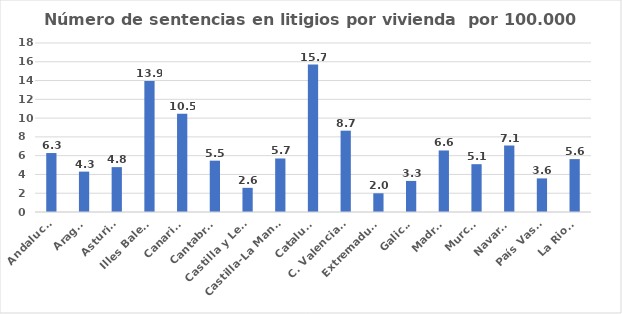
| Category | Número de sentencias en litigios por vivienda  por 100.000 habitantes |
|---|---|
| Andalucía | 6.28 |
| Aragón | 4.301 |
| Asturias | 4.779 |
| Illes Balears | 13.943 |
| Canarias | 10.476 |
| Cantabria | 5.468 |
| Castilla y León | 2.574 |
| Castilla-La Mancha | 5.701 |
| Cataluña | 15.7 |
| C. Valenciana | 8.663 |
| Extremadura | 1.992 |
| Galicia | 3.31 |
| Madrid | 6.554 |
| Murcia | 5.093 |
| Navarra | 7.082 |
| País Vasco | 3.579 |
| La Rioja | 5.634 |